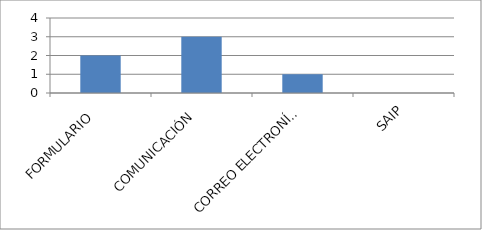
| Category | Series 0 |
|---|---|
| FORMULARIO  | 2 |
| COMUNICACIÓN  | 3 |
| CORREO ELECTRONÍCO  | 1 |
| SAIP | 0 |